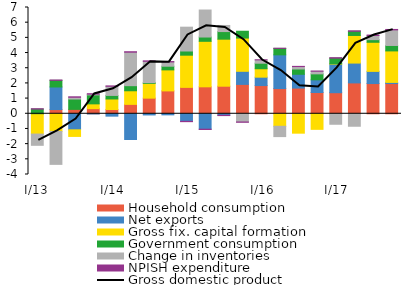
| Category | Household consumption | Net exports | Gross fix. capital formation  | Government consumption | Change in inventories | NPISH expenditure |
|---|---|---|---|---|---|---|
| I/13 | 0.003 | -0.022 | -1.315 | 0.303 | -0.74 | 0.026 |
| II | 0.277 | 1.487 | -1.164 | 0.435 | -2.169 | 0.025 |
| III | 0.289 | -1.058 | -0.434 | 0.682 | 0.116 | 0.029 |
|  IV | 0.337 | -0.011 | 0.317 | 0.589 | 0.05 | 0.028 |
|  I/14 | 0.281 | -0.156 | 0.693 | 0.234 | 0.6 | 0.025 |
| II | 0.619 | -1.693 | 0.897 | 0.335 | 2.204 | 0.031 |
| III | 1.029 | -0.077 | 0.971 | 0.049 | 1.407 | 0.029 |
| IV | 1.506 | -0.071 | 1.386 | 0.242 | 0.279 | 0.028 |
|  I/15 | 1.738 | -0.497 | 2.121 | 0.275 | 1.57 | -0.022 |
| II | 1.775 | -1.015 | 2.998 | 0.283 | 1.779 | -0.021 |
| III | 1.816 | -0.099 | 3.097 | 0.501 | 0.402 | -0.021 |
| IV | 1.935 | 0.862 | 2.19 | 0.45 | -0.54 | -0.019 |
|  I/16 | 1.858 | 0.553 | 0.554 | 0.366 | 0.218 | 0.005 |
| II | 1.66 | 2.221 | -0.824 | 0.426 | -0.679 | 0.01 |
| III | 1.693 | 0.909 | -1.278 | 0.349 | 0.159 | 0.012 |
| IV | 1.402 | 0.834 | -1.026 | 0.393 | 0.173 | 0.011 |
|  I/17 | 1.388 | 1.881 | 0.023 | 0.37 | -0.691 | 0.032 |
| II | 2.033 | 1.306 | 1.819 | 0.276 | -0.822 | 0.031 |
| III | 1.991 | 0.801 | 1.917 | 0.172 | 0.275 | 0.029 |
| IV | 1.991 | 0.075 | 2.075 | 0.358 | 1.027 | 0.028 |